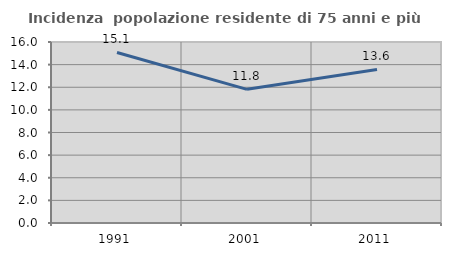
| Category | Incidenza  popolazione residente di 75 anni e più |
|---|---|
| 1991.0 | 15.076 |
| 2001.0 | 11.817 |
| 2011.0 | 13.575 |